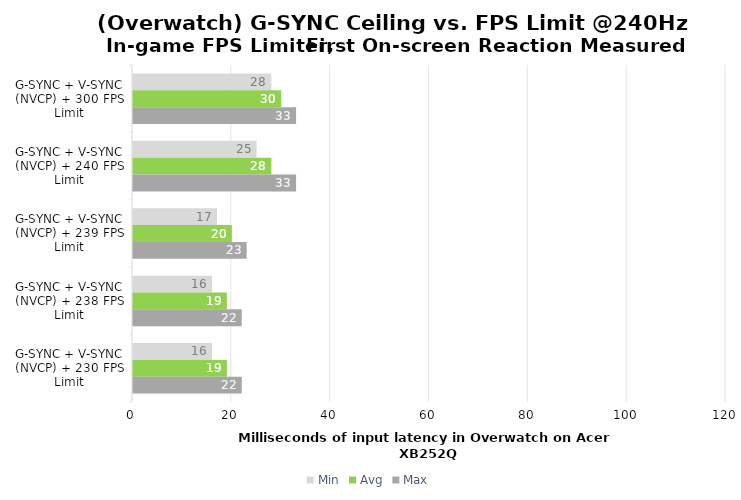
| Category | Min | Avg | Max |
|---|---|---|---|
| G-SYNC + V-SYNC (NVCP) + 300 FPS Limit | 28 | 30 | 33 |
| G-SYNC + V-SYNC (NVCP) + 240 FPS Limit | 25 | 28 | 33 |
| G-SYNC + V-SYNC (NVCP) + 239 FPS Limit | 17 | 20 | 23 |
| G-SYNC + V-SYNC (NVCP) + 238 FPS Limit | 16 | 19 | 22 |
| G-SYNC + V-SYNC (NVCP) + 230 FPS Limit | 16 | 19 | 22 |